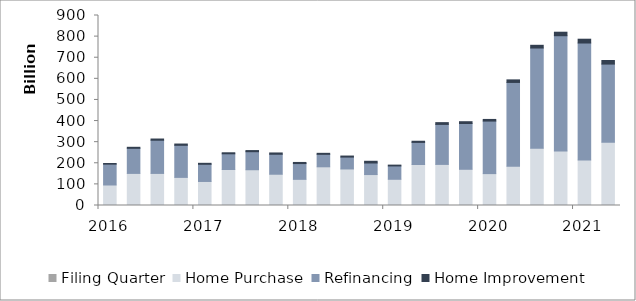
| Category | Filing Quarter | Home Purchase | Refinancing | Home Improvement |
|---|---|---|---|---|
| 2016 | 0 | 97161975641 | 98655367987 | 3206360454 |
| 2016 | 0 | 152048606800 | 118811037286 | 4855337842 |
| 2016 | 0 | 151988519149 | 157179533419 | 5769539506 |
| 2016 | 0 | 133187588388 | 151934080835 | 6064483118 |
| 2017 | 0 | 113829634250 | 81359069638 | 4651062407 |
| 2017 | 0 | 170444454197 | 74433630979 | 4887766339 |
| 2017 | 0 | 169392462027 | 85416781862 | 5370310177 |
| 2017 | 0 | 148104038533 | 94622483848 | 6168449784 |
| 2018 | 0 | 123918265027 | 74690371787 | 5301523310 |
| 2018 | 0 | 183305206616 | 59053391038 | 4783614107 |
| 2018 | 0 | 173035680065 | 56269972282 | 4971421243 |
| 2018 | 0 | 146582947480 | 54748609396 | 8157899656 |
| 2019 | 0 | 124167950342 | 63182176214 | 3940300862 |
| 2019 | 0 | 194164936334 | 104689106436 | 5528693711 |
| 2019 | 0 | 194652715554 | 189456022622 | 8448960420 |
| 2019 | 0 | 171561849680 | 216962933599 | 8413981306 |
| 2020 | 0 | 151028397006 | 248871412763 | 7770183976 |
| 2020 | 0 | 185985799397 | 396934261410 | 12103480107 |
| 2020 | 0 | 271366537287 | 474608621721 | 12884703765 |
| 2020 | 0 | 258526361174 | 545685612866 | 16621237738 |
| 2021 | 0 | 215247410173 | 554390606656 | 18066603510 |
| 2021 | 0 | 300073457550 | 369759496122 | 16937190867 |